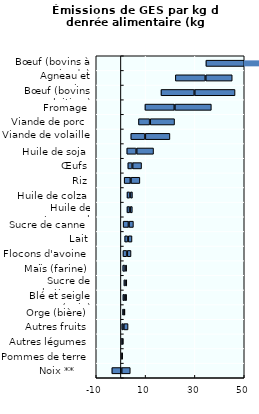
| Category | Espace blanc (10ème percentile) | Du 10ème percentile à la moyenne | Moyenne | De la moyenne au 90ème percentile |
|---|---|---|---|---|
| Noix **     | -3.68 | 0.06 | 0.26 | 3.48 |
| Pommes de terre | 0.15 | 0.17 | 0.26 | 0.04 |
| Autres légumes | 0.23 | 0.19 | 0.26 | 0.28 |
| Autres fruits | 0.35 | 0.58 | 0.26 | 1.71 |
| Orge (bière) | 0.69 | 0.36 | 0.26 | 0.33 |
| Blé et seigle (pain) | 0.8 | 0.64 | 0.26 | 0.63 |
| Sucre de betterave | 1.21 | 0.44 | 0.26 | 0.47 |
| Maïs (farine) | 0.74 | 0.93 | 0.26 | 0.4 |
| Flocons d'avoine | 0.83 | 1.51 | 0.26 | 1.5 |
| Lait | 1.53 | 1.21 | 0.26 | 1.49 |
| Sucre de canne | 0.9 | 2.13 | 0.26 | 1.78 |
| Huile de tournesol | 2.45 | 1.04 | 0.26 | 0.88 |
| Huile de colza | 2.47 | 1.14 | 0.26 | 0.81 |
| Riz | 1.32 | 2.49 | 0.26 | 3.62 |
| Œufs | 2.8 | 1.7 | 0.26 | 3.61 |
| Huile de soja | 2.38 | 3.76 | 0.26 | 6.83 |
| Viande de volaille | 4.01 | 5.64 | 0.26 | 9.96 |
| Viande de porc | 7.12 | 4.52 | 0.26 | 9.85 |
| Fromage | 9.74 | 11.89 | 0.26 | 14.77 |
| Bœuf (bovins laitiers) | 16.24 | 13.45 | 0.26 | 16.32 |
| Agneau et mouton | 22.07 | 12.08 | 0.26 | 10.72 |
| Bœuf (bovins à viande) | 34.46 | 54.96 | 0.26 | 98.34 |